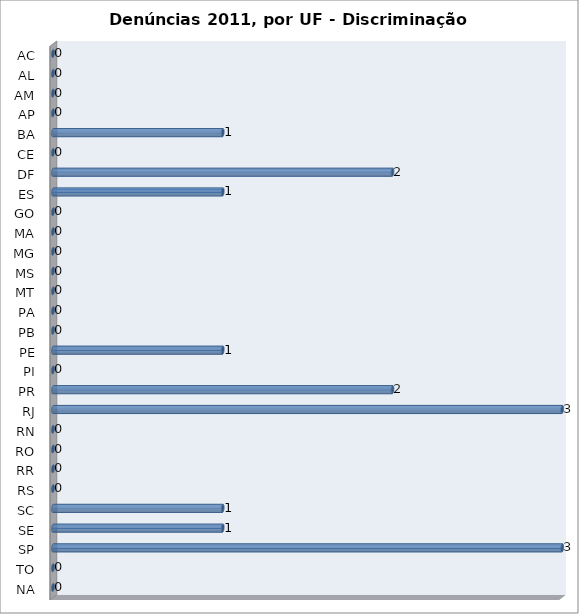
| Category | Series 0 |
|---|---|
| AC | 0 |
| AL | 0 |
| AM | 0 |
| AP | 0 |
| BA | 1 |
| CE | 0 |
| DF | 2 |
| ES | 1 |
| GO | 0 |
| MA | 0 |
| MG | 0 |
| MS | 0 |
| MT | 0 |
| PA | 0 |
| PB | 0 |
| PE | 1 |
| PI | 0 |
| PR | 2 |
| RJ | 3 |
| RN | 0 |
| RO | 0 |
| RR | 0 |
| RS | 0 |
| SC | 1 |
| SE | 1 |
| SP | 3 |
| TO | 0 |
| NA | 0 |